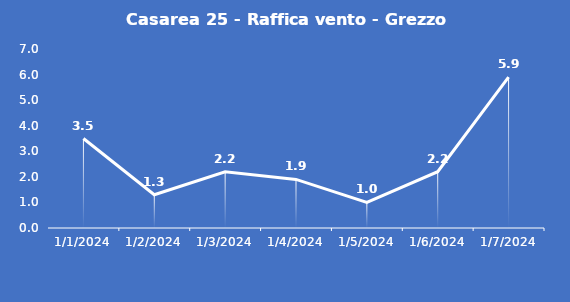
| Category | Casarea 25 - Raffica vento - Grezzo (m/s) |
|---|---|
| 1/1/24 | 3.5 |
| 1/2/24 | 1.3 |
| 1/3/24 | 2.2 |
| 1/4/24 | 1.9 |
| 1/5/24 | 1 |
| 1/6/24 | 2.2 |
| 1/7/24 | 5.9 |